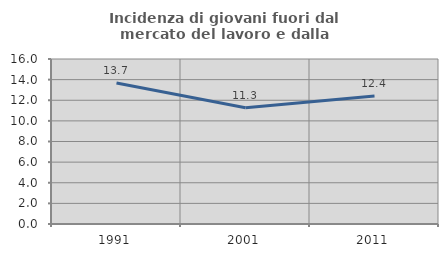
| Category | Incidenza di giovani fuori dal mercato del lavoro e dalla formazione  |
|---|---|
| 1991.0 | 13.682 |
| 2001.0 | 11.275 |
| 2011.0 | 12.413 |